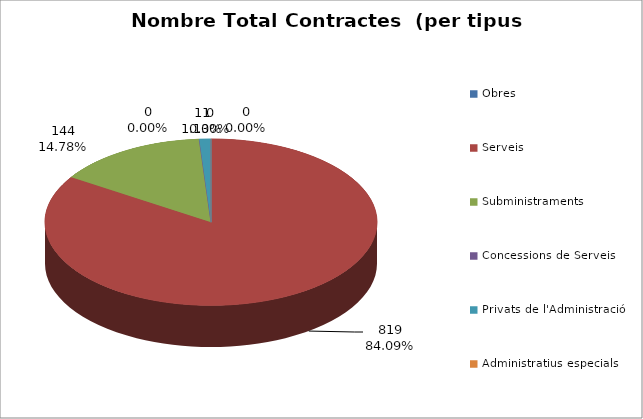
| Category | Nombre Total Contractes |
|---|---|
| Obres | 0 |
| Serveis | 819 |
| Subministraments | 144 |
| Concessions de Serveis | 0 |
| Privats de l'Administració | 11 |
| Administratius especials | 0 |